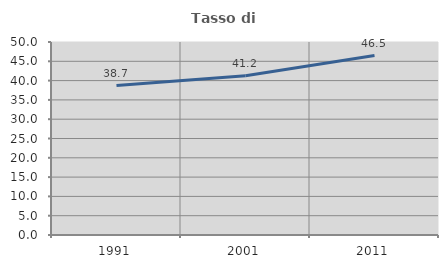
| Category | Tasso di occupazione   |
|---|---|
| 1991.0 | 38.706 |
| 2001.0 | 41.244 |
| 2011.0 | 46.498 |